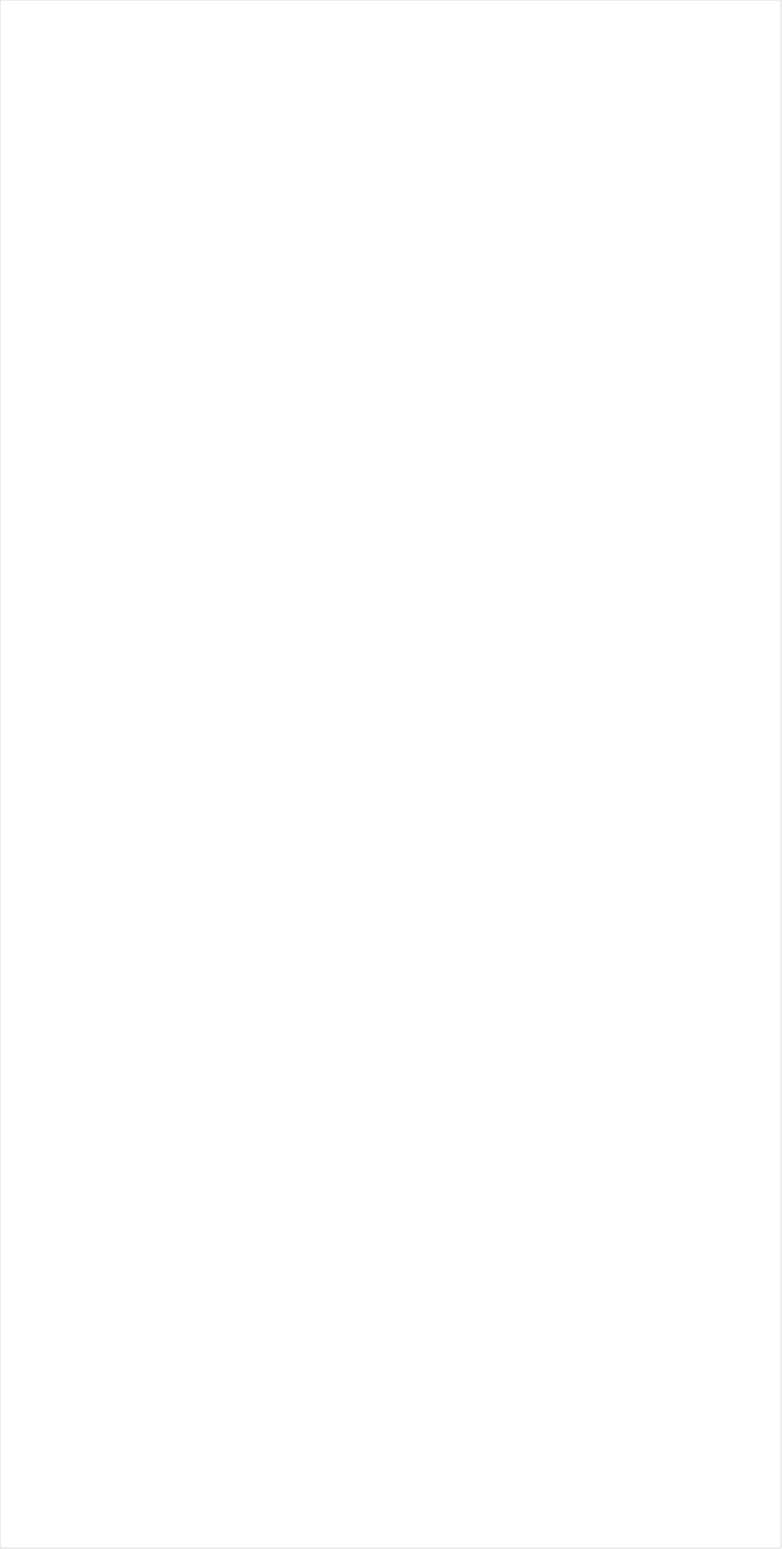
| Category | Total |
|---|---|
| PBS | -0.172 |
| Hallmark Movies & Mysteries | -0.169 |
| INSP | -0.16 |
| Fox Business | -0.157 |
| RFD TV | -0.144 |
| MSNBC | -0.12 |
| Smithsonian | -0.102 |
| Hallmark | -0.095 |
| Fox News | -0.089 |
| Tennis Channel | -0.084 |
| PAC-12 Network | -0.08 |
| Weather Channel | -0.074 |
| Outdoor Channel | -0.07 |
| WGN America | -0.067 |
| CBS | -0.06 |
| ION | -0.05 |
| Olympic Channel | -0.05 |
| Discovery Life Channel | -0.044 |
| TV LAND | -0.042 |
| Bloomberg HD | -0.037 |
| UP TV | -0.036 |
| National Geographic Wild | -0.033 |
| NBC | -0.032 |
| CNN | -0.03 |
| Great American Country | -0.029 |
| SundanceTV | -0.029 |
| HGTV | -0.027 |
| CNBC | -0.022 |
| Game Show | -0.02 |
| American Heroes Channel | -0.019 |
| ABC | -0.018 |
| Science Channel | -0.018 |
| NBC Sports | -0.018 |
| History Channel | -0.017 |
| Animal Planet | -0.015 |
| Golf | -0.014 |
| Big Ten Network | -0.014 |
| Headline News | -0.011 |
| Disney Junior US | -0.009 |
| DIY | -0.004 |
| OXYGEN | -0.002 |
| CBS Sports | 0.001 |
| BBC America | 0.003 |
| Ovation | 0.003 |
| The Sportsman Channel | 0.007 |
| Motor Trend Network | 0.008 |
| FYI | 0.01 |
| Lifetime Movies | 0.012 |
| FOX | 0.013 |
| CMTV | 0.014 |
| Galavision | 0.014 |
| Nick Jr. | 0.016 |
| Food Network | 0.016 |
| National Geographic | 0.018 |
| POP | 0.019 |
| Reelz Channel | 0.021 |
| WE TV | 0.022 |
| TLC | 0.022 |
| FOX Sports 2 | 0.022 |
| Investigation Discovery | 0.023 |
| Lifetime | 0.025 |
| Oprah Winfrey Network | 0.025 |
| Discovery Family Channel | 0.028 |
| Destination America | 0.03 |
| Paramount Network | 0.032 |
| CW | 0.034 |
| NFL Network | 0.035 |
| Fox Sports 1 | 0.035 |
| Discovery Channel | 0.036 |
| AMC | 0.036 |
| FX Movie Channel | 0.038 |
| SYFY | 0.039 |
| TUDN | 0.039 |
| USA Network | 0.039 |
| NHL | 0.04 |
| A&E | 0.041 |
| Freeform | 0.041 |
| Independent Film (IFC) | 0.042 |
| Travel | 0.043 |
| TBS | 0.045 |
| FXDEP | 0.047 |
| Logo | 0.05 |
| Adult Swim | 0.052 |
| Universal Kids | 0.053 |
| NBC Universo | 0.054 |
| NBA TV | 0.056 |
| Univision | 0.057 |
| E! | 0.057 |
| BRAVO | 0.058 |
| BET | 0.059 |
| UniMas | 0.06 |
| Cooking Channel | 0.061 |
| MLB Network | 0.063 |
| MTV | 0.064 |
| Viceland | 0.066 |
| Telemundo | 0.067 |
| FX | 0.068 |
| TNT | 0.069 |
| MTV2 | 0.071 |
| ESPN | 0.071 |
| ESPN Deportes | 0.072 |
| FXX | 0.072 |
| Comedy Central | 0.074 |
| ESPN2 | 0.077 |
| Nick@Nite | 0.079 |
| Disney XD | 0.082 |
| BET Her | 0.082 |
| Nick | 0.085 |
| Teen Nick | 0.087 |
| ESPNU | 0.09 |
| ESPNEWS | 0.09 |
| MyNetworkTV | 0.095 |
| truTV | 0.097 |
| Cartoon Network | 0.099 |
| VH1 | 0.101 |
| TV ONE | 0.108 |
| Disney Channel | 0.122 |
| Nick Toons | 0.124 |